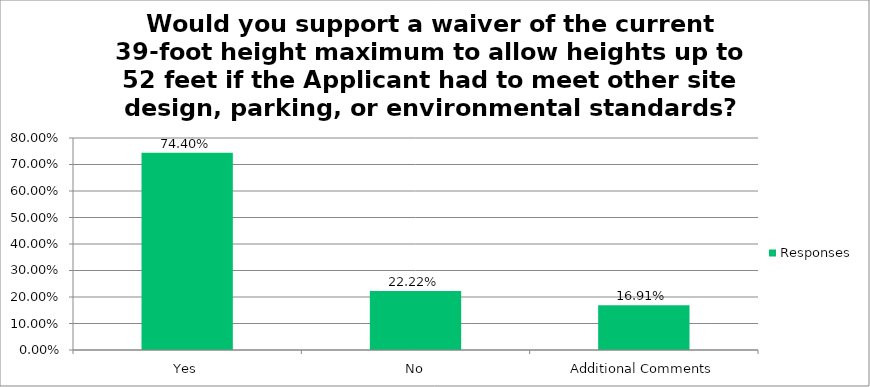
| Category | Responses |
|---|---|
| Yes | 0.744 |
| No | 0.222 |
| Additional Comments | 0.169 |